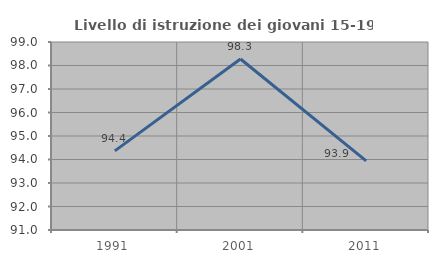
| Category | Livello di istruzione dei giovani 15-19 anni |
|---|---|
| 1991.0 | 94.366 |
| 2001.0 | 98.276 |
| 2011.0 | 93.939 |